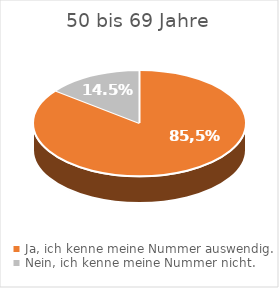
| Category | 50–69 Jahre |
|---|---|
| Ja, ich kenne meine Nummer auswendig. | 85.5 |
| Nein, ich kenne meine Nummer nicht.  | 14.5 |